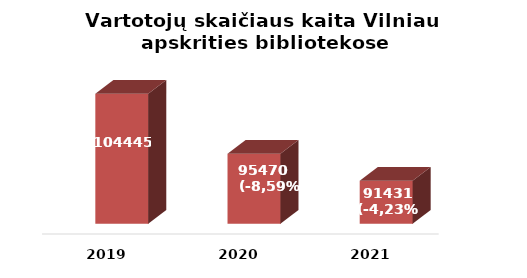
| Category | Series 0 |
|---|---|
| 2019.0 | 104445 |
| 2020.0 | 95470 |
| 2021.0 | 91431 |